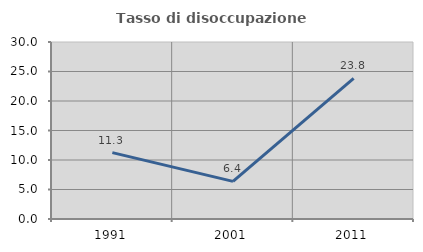
| Category | Tasso di disoccupazione giovanile  |
|---|---|
| 1991.0 | 11.254 |
| 2001.0 | 6.383 |
| 2011.0 | 23.841 |